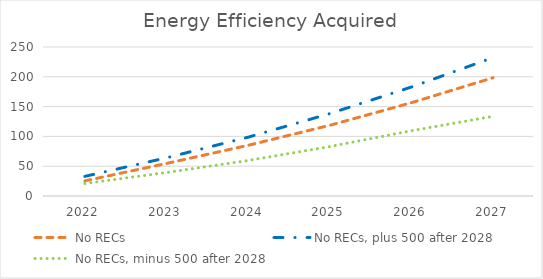
| Category | No RECs | No RECs, plus 500 after 2028 | No RECs, minus 500 after 2028 |
|---|---|---|---|
| 2022.0 | 25.359 | 32.933 | 20.952 |
| 2023.0 | 54.634 | 64.101 | 39.43 |
| 2024.0 | 85.022 | 98.685 | 59.557 |
| 2025.0 | 118.638 | 138.267 | 82.936 |
| 2026.0 | 156.559 | 182.875 | 109.52 |
| 2027.0 | 198.466 | 232.319 | 133.755 |